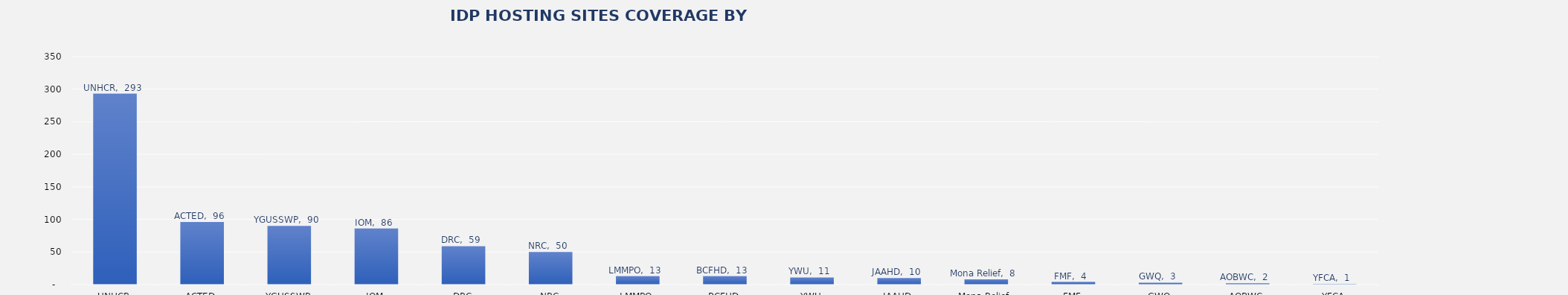
| Category | Total |
|---|---|
| UNHCR | 293 |
| ACTED | 96 |
| YGUSSWP | 90 |
| IOM | 86 |
| DRC | 59 |
| NRC | 50 |
| LMMPO | 13 |
| BCFHD | 13 |
| YWU | 11 |
| JAAHD | 10 |
| Mona Relief | 8 |
| FMF | 4 |
| GWQ | 3 |
| AOBWC | 2 |
| YFCA | 1 |